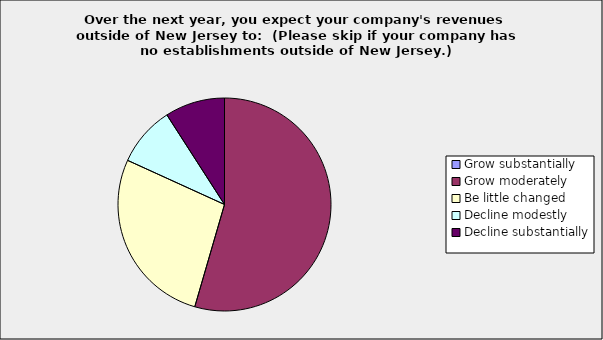
| Category | Series 0 |
|---|---|
| Grow substantially | 0 |
| Grow moderately | 0.545 |
| Be little changed | 0.273 |
| Decline modestly | 0.091 |
| Decline substantially | 0.091 |